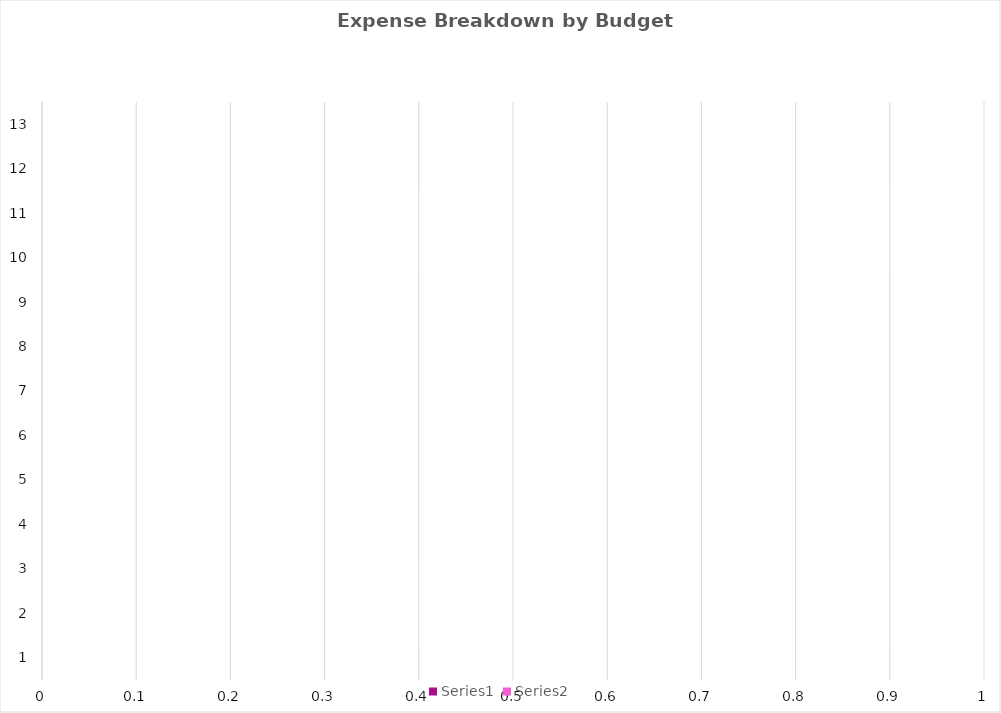
| Category | Series 0 | Series 1 |
|---|---|---|
| 0 | 0 | 0 |
| 1 | 0 | 0 |
| 2 | 0 | 0 |
| 3 | 0 | 0 |
| 4 | 0 | 0 |
| 5 | 0 | 0 |
| 6 | 0 | 0 |
| 7 | 0 | 0 |
| 8 | 0 | 0 |
| 9 | 0 | 0 |
| 10 | 0 | 0 |
| 11 | 0 | 0 |
| 12 | 0 | 0 |